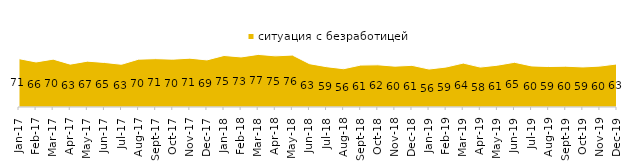
| Category | ситуация с безработицей |
|---|---|
| 2017-01-01 | 70.75 |
| 2017-02-01 | 65.9 |
| 2017-03-01 | 70.05 |
| 2017-04-01 | 62.7 |
| 2017-05-01 | 67.1 |
| 2017-06-01 | 65.2 |
| 2017-07-01 | 62.5 |
| 2017-08-01 | 70 |
| 2017-09-01 | 70.75 |
| 2017-10-01 | 70 |
| 2017-11-01 | 71.45 |
| 2017-12-01 | 68.9 |
| 2018-01-01 | 75.4 |
| 2018-02-01 | 73.25 |
| 2018-03-01 | 76.95 |
| 2018-04-01 | 74.85 |
| 2018-05-01 | 76 |
| 2018-06-01 | 63.4 |
| 2018-07-01 | 59 |
| 2018-08-01 | 56 |
| 2018-09-01 | 61.35 |
| 2018-10-01 | 61.75 |
| 2018-11-01 | 59.78 |
| 2018-12-01 | 60.95 |
| 2019-01-01 | 55.55 |
| 2019-02-01 | 58.5 |
| 2019-03-01 | 64.296 |
| 2019-04-01 | 58.416 |
| 2019-05-01 | 61.169 |
| 2019-06-01 | 65.436 |
| 2019-07-01 | 60.099 |
| 2019-08-01 | 59.241 |
| 2019-09-01 | 59.703 |
| 2019-10-01 | 58.614 |
| 2019-11-01 | 59.851 |
| 2019-12-01 | 63.02 |